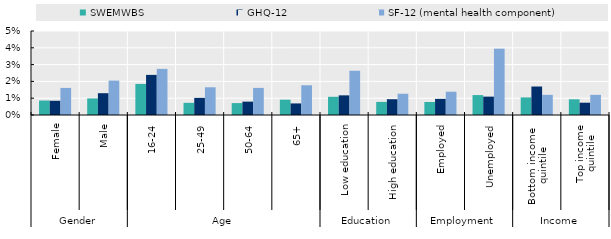
| Category | SWEMWBS | GHQ-12 | SF-12 (mental health component) |
|---|---|---|---|
| 0 | 0.009 | 0.008 | 0.016 |
| 1 | 0.01 | 0.013 | 0.02 |
| 2 | 0.018 | 0.024 | 0.027 |
| 3 | 0.007 | 0.01 | 0.016 |
| 4 | 0.007 | 0.008 | 0.016 |
| 5 | 0.009 | 0.007 | 0.018 |
| 6 | 0.011 | 0.012 | 0.026 |
| 7 | 0.008 | 0.009 | 0.013 |
| 8 | 0.008 | 0.01 | 0.014 |
| 9 | 0.012 | 0.011 | 0.039 |
| 10 | 0.01 | 0.017 | 0.012 |
| 11 | 0.009 | 0.007 | 0.012 |